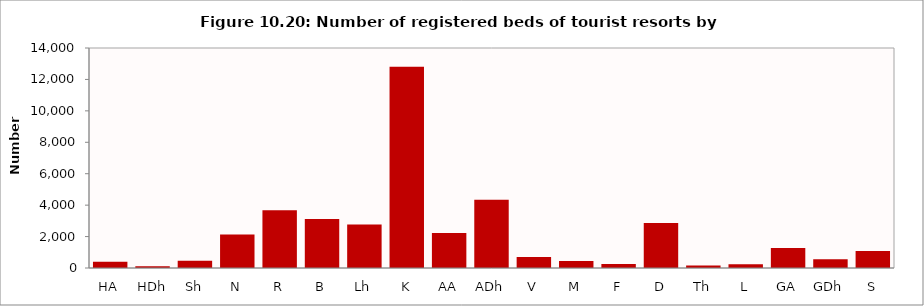
| Category | Series 0 |
|---|---|
| HA | 394 |
| HDh | 118 |
| Sh | 457 |
| N | 2134 |
| R | 3670 |
| B | 3120 |
| Lh | 2774 |
| K | 12810 |
| AA | 2224 |
| ADh | 4350 |
| V | 694 |
| M | 440 |
| F | 250 |
| D | 2860 |
| Th | 152 |
| L | 242 |
| GA | 1279 |
| GDh | 550 |
| S | 1086 |